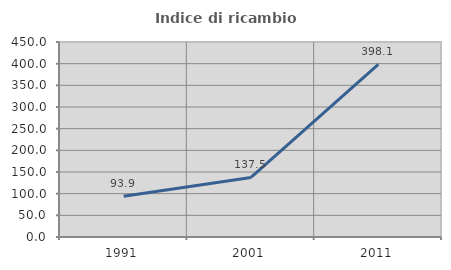
| Category | Indice di ricambio occupazionale  |
|---|---|
| 1991.0 | 93.913 |
| 2001.0 | 137.5 |
| 2011.0 | 398.148 |